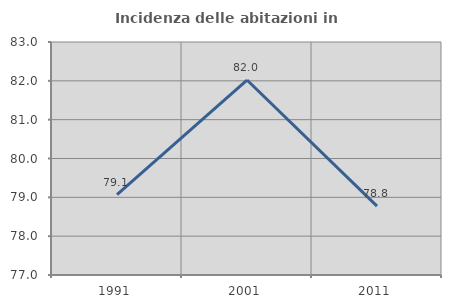
| Category | Incidenza delle abitazioni in proprietà  |
|---|---|
| 1991.0 | 79.067 |
| 2001.0 | 82.021 |
| 2011.0 | 78.772 |